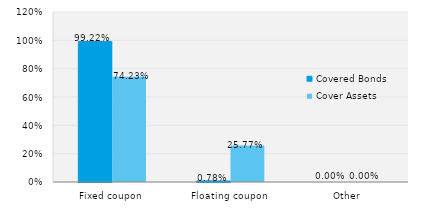
| Category | Covered Bonds | Cover Assets |
|---|---|---|
| Fixed coupon | 0.992 | 0.742 |
| Floating coupon | 0.008 | 0.258 |
| Other | 0 | 0 |